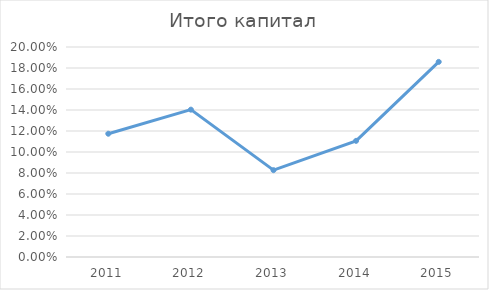
| Category | Итого капитал |
|---|---|
| 2011.0 | 0.117 |
| 2012.0 | 0.14 |
| 2013.0 | 0.083 |
| 2014.0 | 0.111 |
| 2015.0 | 0.186 |